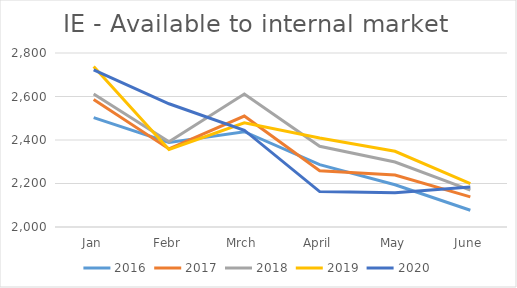
| Category | 2016 | 2017 | 2018 | 2019 | 2020 |
|---|---|---|---|---|---|
| Jan | 2503 | 2586.093 | 2611.56 | 2737.968 | 2721.933 |
| Febr | 2389 | 2359.048 | 2391.66 | 2356.694 | 2566.504 |
| Mrch | 2438 | 2510.063 | 2611.178 | 2478.817 | 2445.003 |
| April | 2287 | 2258.38 | 2371.122 | 2408.793 | 2162.945 |
| May | 2194 | 2239.168 | 2298.828 | 2348.17 | 2157.642 |
| June | 2077 | 2138.488 | 2169.423 | 2199.416 | 2184.121 |